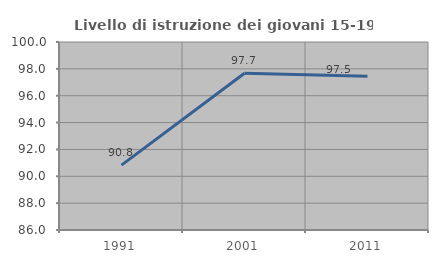
| Category | Livello di istruzione dei giovani 15-19 anni |
|---|---|
| 1991.0 | 90.83 |
| 2001.0 | 97.674 |
| 2011.0 | 97.452 |